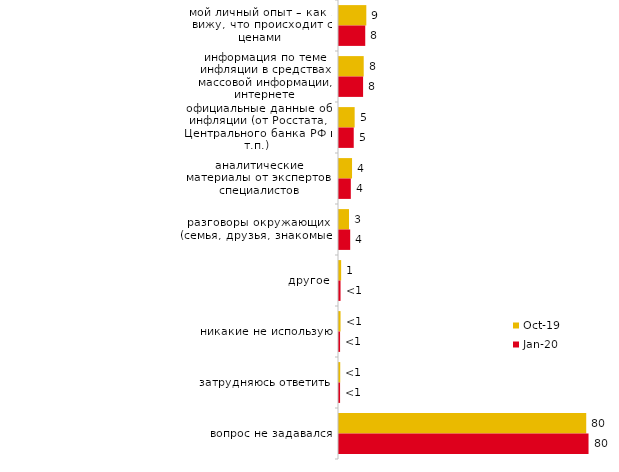
| Category | окт.19 | янв.20 |
|---|---|---|
| мой личный опыт – как я вижу, что происходит с ценами | 8.812 | 8.465 |
| информация по теме инфляции в средствах массовой информации, интернете | 7.97 | 7.772 |
| официальные данные об инфляции (от Росстата, Центрального банка РФ и т.п.) | 5.05 | 4.752 |
| аналитические материалы от экспертов, специалистов | 4.208 | 3.812 |
| разговоры окружающих (семья, друзья, знакомые) | 3.218 | 3.614 |
| другое | 0.693 | 0.495 |
| никакие не использую | 0.495 | 0.347 |
| затрудняюсь ответить | 0.396 | 0.347 |
| вопрос не задавался | 79.752 | 80.495 |